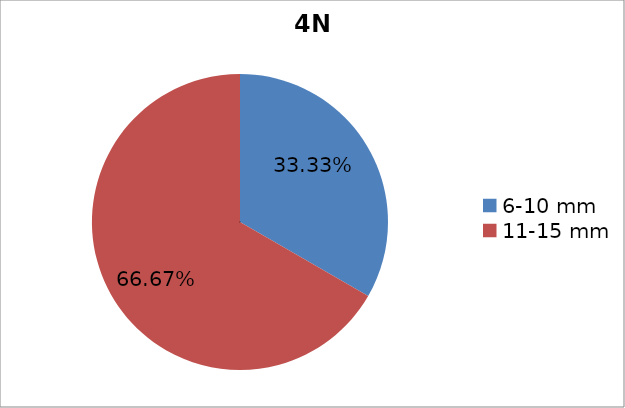
| Category | Series 0 |
|---|---|
| 6-10 mm | 0.333 |
| 11-15 mm | 0.667 |